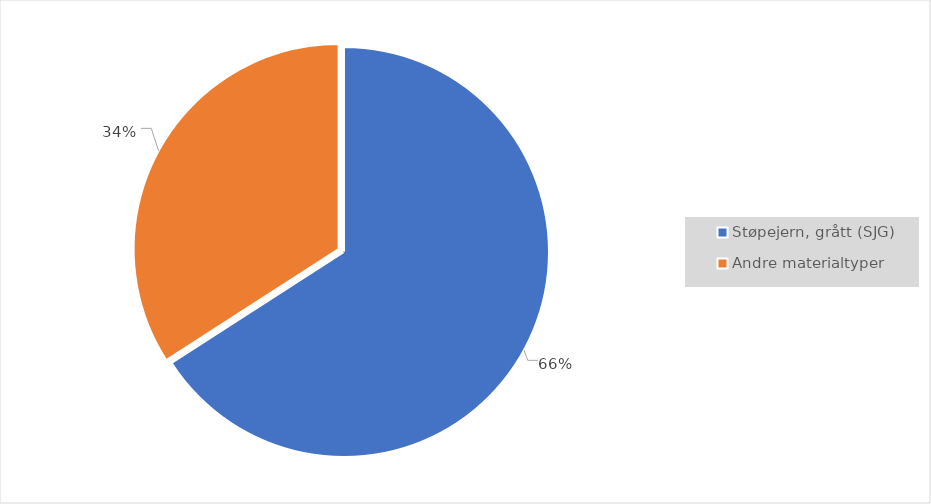
| Category | Series 0 |
|---|---|
| Støpejern, grått (SJG) | 0.659 |
| Andre materialtyper | 0.341 |